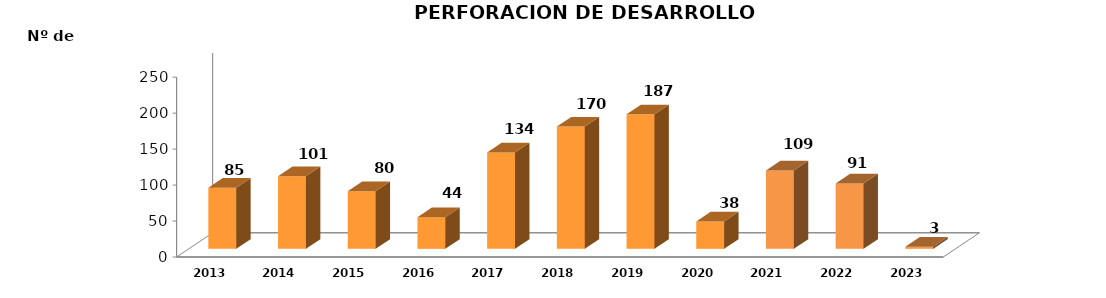
| Category | Series 0 |
|---|---|
| 2013.0 | 85 |
| 2014.0 | 101 |
| 2015.0 | 80 |
| 2016.0 | 44 |
| 2017.0 | 134 |
| 2018.0 | 170 |
| 2019.0 | 187 |
| 2020.0 | 38 |
| 2021.0 | 109 |
| 2022.0 | 91 |
| 2023.0 | 3 |